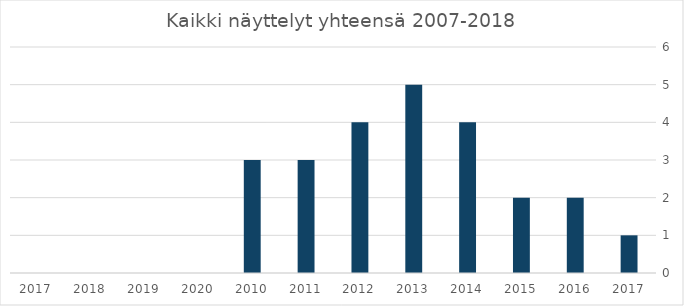
| Category | Kaikki näyttelyt yhteensä |
|---|---|
| 2017.0 | 1 |
| 2016.0 | 2 |
| 2015.0 | 2 |
| 2014.0 | 4 |
| 2013.0 | 5 |
| 2012.0 | 4 |
| 2011.0 | 3 |
| 2010.0 | 3 |
| 2020.0 | 0 |
| 2019.0 | 0 |
| 2018.0 | 0 |
| 2017.0 | 0 |